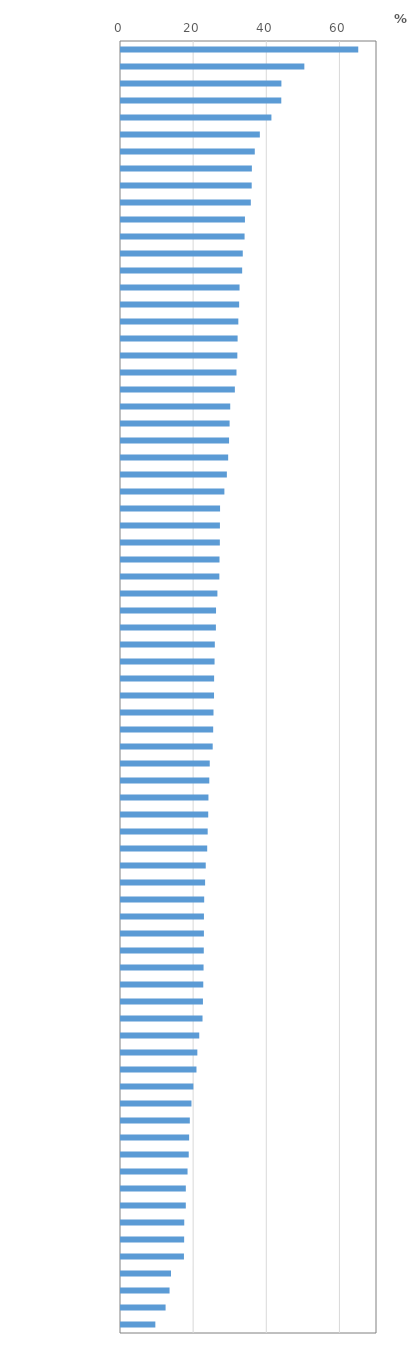
| Category | Percentage of students who reported being bullied at least a few times a month, by the following student characteristics |
|---|---|
| Philippines | 64.874 |
| Brunei Darussalam | 50.134 |
| Dominican Republic | 43.861 |
| Morocco | 43.829 |
| Indonesia | 41.129 |
| Jordan | 37.962 |
| Russia | 36.581 |
| Baku (Azerbaijan) | 35.786 |
| Malaysia | 35.737 |
| Latvia | 35.497 |
| Bulgaria | 33.89 |
| Romania | 33.791 |
| Qatar | 33.297 |
| Panama | 33.131 |
| Argentina | 32.418 |
| Colombia | 32.309 |
| Kazakhstan | 32.083 |
| Kosovo | 31.886 |
| Malta | 31.811 |
| New Zealand | 31.577 |
| United Arab Emirates | 31.134 |
| Saudi Arabia | 29.865 |
| Czech Republic | 29.699 |
| Australia | 29.549 |
| Hong Kong (China) | 29.303 |
| Brazil | 28.947 |
| Slovak Republic | 28.27 |
| Thailand | 27.089 |
| Macao (China) | 27.047 |
| United Kingdom | 27.028 |
| Greece | 26.938 |
| Viet Nam | 26.894 |
| Poland | 26.36 |
| Singapore | 25.986 |
| United States | 25.949 |
| Uruguay | 25.654 |
| Serbia | 25.585 |
| Albania | 25.46 |
| Estonia | 25.437 |
| Bosnia and Herzegovina | 25.292 |
| Canada | 25.206 |
| Montenegro | 25.072 |
| Costa Rica | 24.269 |
| Turkey | 24.147 |
| Moldova | 23.909 |
| Chile | 23.851 |
| Italy | 23.703 |
| Georgia | 23.572 |
| Austria | 23.17 |
| Mexico | 22.997 |
| OECD average | 22.745 |
| Germany | 22.677 |
| Ireland | 22.673 |
| Lithuania | 22.635 |
| Hungary | 22.575 |
| Peru | 22.497 |
| Switzerland | 22.404 |
| Ukraine | 22.291 |
| Denmark | 21.397 |
| Slovenia | 20.874 |
| Luxembourg | 20.637 |
| France | 19.79 |
| Sweden | 19.268 |
| Norway | 18.818 |
| Belgium | 18.632 |
| Belarus | 18.521 |
| Croatia | 18.196 |
| Finland | 17.725 |
| B-S-J-Z (China) | 17.722 |
| Spain | 17.296 |
| Japan | 17.268 |
| Iceland | 17.21 |
| Portugal | 13.673 |
| Chinese Taipei | 13.279 |
| Netherlands | 12.191 |
| Korea | 9.391 |